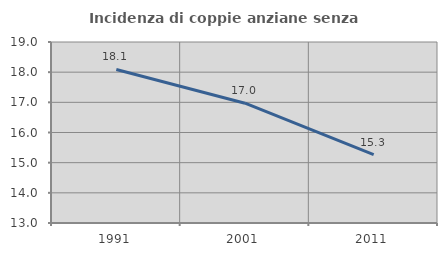
| Category | Incidenza di coppie anziane senza figli  |
|---|---|
| 1991.0 | 18.089 |
| 2001.0 | 16.971 |
| 2011.0 | 15.267 |